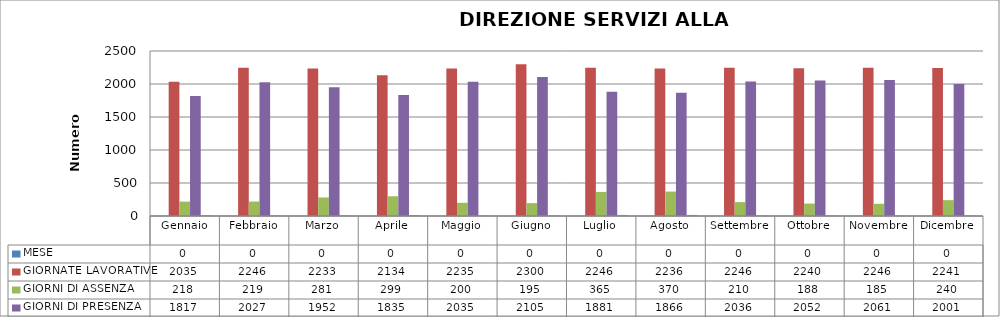
| Category | MESE | GIORNATE LAVORATIVE | GIORNI DI ASSENZA | GIORNI DI PRESENZA | %  ASSENZA |
|---|---|---|---|---|---|
| Gennaio | 0 | 2035 | 218 | 1817 | 10.713 |
| Febbraio | 0 | 2246 | 219 | 2027 | 9.751 |
| Marzo | 0 | 2233 | 281 | 1952 | 12.584 |
| Aprile | 0 | 2134 | 299 | 1835 | 14.011 |
| Maggio | 0 | 2235 | 200 | 2035 | 8.949 |
| Giugno | 0 | 2300 | 195 | 2105 | 8.478 |
| Luglio | 0 | 2246 | 365 | 1881 | 16.251 |
| Agosto | 0 | 2236 | 370 | 1866 | 16.547 |
| Settembre | 0 | 2246 | 210 | 2036 | 9.35 |
| Ottobre | 0 | 2240 | 188 | 2052 | 8.393 |
| Novembre | 0 | 2246 | 185 | 2061 | 8.237 |
| Dicembre | 0 | 2241 | 240 | 2001 | 10.71 |